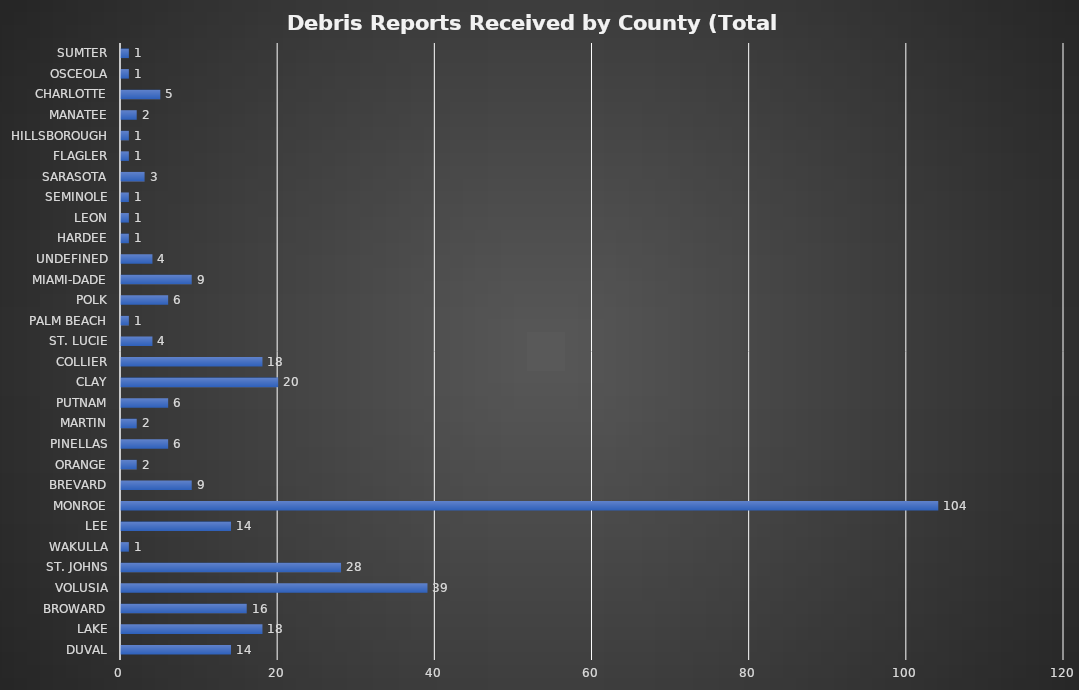
| Category | Series 0 |
|---|---|
| DUVAL | 14 |
| LAKE | 18 |
| BROWARD | 16 |
| VOLUSIA | 39 |
| ST. JOHNS | 28 |
| WAKULLA | 1 |
| LEE | 14 |
| MONROE | 104 |
| BREVARD | 9 |
| ORANGE | 2 |
| PINELLAS | 6 |
| MARTIN | 2 |
| PUTNAM | 6 |
| CLAY | 20 |
| COLLIER | 18 |
| ST. LUCIE | 4 |
| PALM BEACH | 1 |
| POLK | 6 |
| MIAMI-DADE | 9 |
| UNDEFINED | 4 |
| HARDEE | 1 |
| LEON | 1 |
| SEMINOLE | 1 |
| SARASOTA | 3 |
| FLAGLER | 1 |
| HILLSBOROUGH | 1 |
| MANATEE | 2 |
| CHARLOTTE | 5 |
| OSCEOLA | 1 |
| SUMTER | 1 |